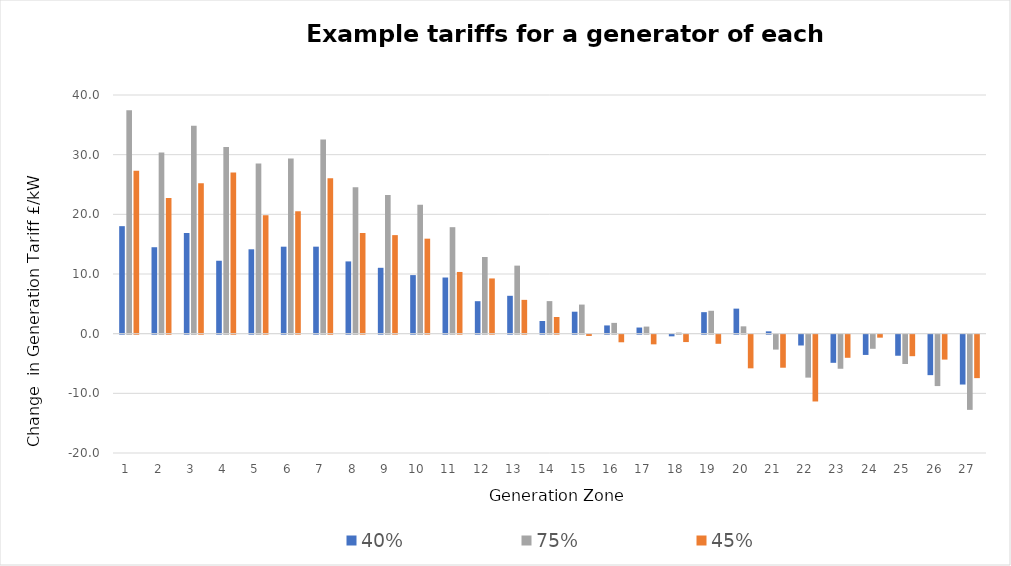
| Category | 40% | 75% | 45% |
|---|---|---|---|
| 1.0 | 18.018 | 37.431 | 27.316 |
| 2.0 | 14.487 | 30.351 | 22.753 |
| 3.0 | 16.872 | 34.851 | 25.22 |
| 4.0 | 12.221 | 31.266 | 26.997 |
| 5.0 | 14.14 | 28.506 | 19.848 |
| 6.0 | 14.578 | 29.377 | 20.514 |
| 7.0 | 14.582 | 32.525 | 26.059 |
| 8.0 | 12.11 | 24.541 | 16.872 |
| 9.0 | 11.039 | 23.232 | 16.517 |
| 10.0 | 9.815 | 21.597 | 15.921 |
| 11.0 | 9.41 | 17.846 | 10.344 |
| 12.0 | 5.443 | 12.849 | 9.255 |
| 13.0 | 6.347 | 11.403 | 5.667 |
| 14.0 | 2.121 | 5.456 | 2.798 |
| 15.0 | 3.681 | 4.875 | -0.216 |
| 16.0 | 1.381 | 1.808 | -1.276 |
| 17.0 | 1.028 | 1.188 | -1.621 |
| 18.0 | -0.278 | 0.178 | -1.239 |
| 19.0 | 3.605 | 3.836 | -1.529 |
| 20.0 | 4.196 | 1.229 | -5.642 |
| 21.0 | 0.387 | -2.502 | -5.54 |
| 22.0 | -1.812 | -7.2 | -11.197 |
| 23.0 | -4.718 | -5.712 | -3.876 |
| 24.0 | -3.397 | -2.367 | -0.502 |
| 25.0 | -3.533 | -4.919 | -3.608 |
| 26.0 | -6.785 | -8.615 | -4.179 |
| 27.0 | -8.358 | -12.603 | -7.284 |